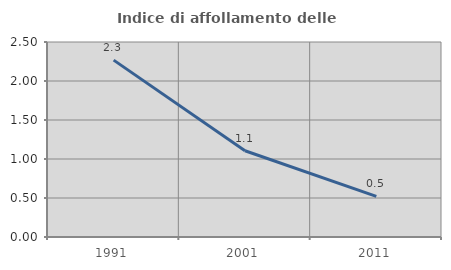
| Category | Indice di affollamento delle abitazioni  |
|---|---|
| 1991.0 | 2.268 |
| 2001.0 | 1.106 |
| 2011.0 | 0.52 |